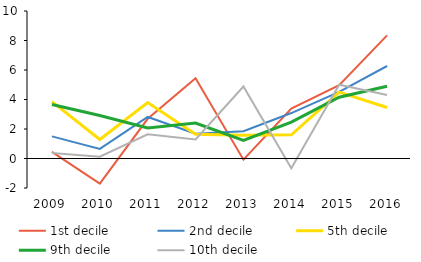
| Category | 1st decile | 2nd decile | 5th decile | 9th decile | 10th decile |
|---|---|---|---|---|---|
| 2009.0 | 0.451 | 1.502 | 3.851 | 3.66 | 0.381 |
| 2010.0 | -1.703 | 0.653 | 1.289 | 2.911 | 0.121 |
| 2011.0 | 2.692 | 2.818 | 3.797 | 2.072 | 1.639 |
| 2012.0 | 5.437 | 1.679 | 1.642 | 2.407 | 1.29 |
| 2013.0 | -0.079 | 1.854 | 1.569 | 1.22 | 4.883 |
| 2014.0 | 3.388 | 3.082 | 1.61 | 2.472 | -0.666 |
| 2015.0 | 4.972 | 4.519 | 4.496 | 4.152 | 5.006 |
| 2016.0 | 8.348 | 6.271 | 3.459 | 4.898 | 4.309 |